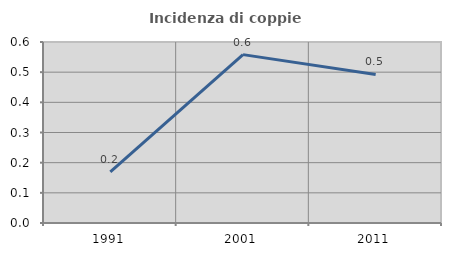
| Category | Incidenza di coppie miste |
|---|---|
| 1991.0 | 0.169 |
| 2001.0 | 0.558 |
| 2011.0 | 0.492 |